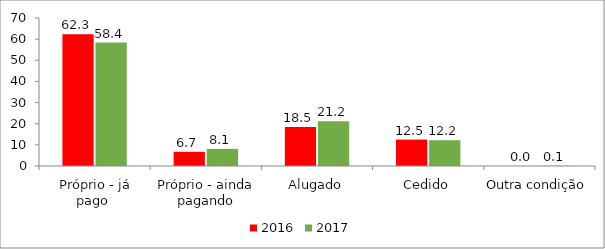
| Category | 2016 | 2017 |
|---|---|---|
| Próprio - já pago  | 62.3 | 58.4 |
| Próprio - ainda pagando | 6.7 | 8.1 |
| Alugado | 18.5 | 21.2 |
| Cedido | 12.5 | 12.2 |
| Outra condição | 0 | 0.1 |